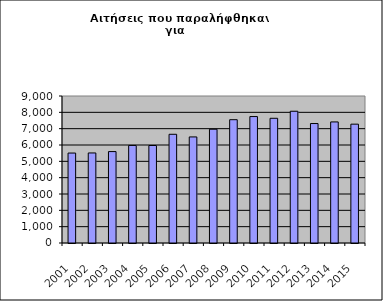
| Category | Series 1 |
|---|---|
| 2001.0 | 5507 |
| 2002.0 | 5513 |
| 2003.0 | 5597 |
| 2004.0 | 5974 |
| 2005.0 | 5970 |
| 2006.0 | 6656 |
| 2007.0 | 6494 |
| 2008.0 | 6966 |
| 2009.0 | 7549 |
| 2010.0 | 7742 |
| 2011.0 | 7635 |
| 2012.0 | 8067 |
| 2013.0 | 7314 |
| 2014.0 | 7412 |
| 2015.0 | 7276 |